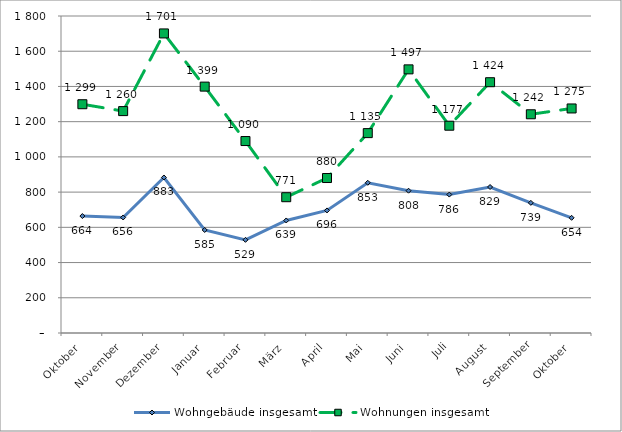
| Category | Wohngebäude insgesamt | Wohnungen insgesamt |
|---|---|---|
| Oktober | 664 | 1299 |
| November | 656 | 1260 |
| Dezember | 883 | 1701 |
| Januar | 585 | 1399 |
| Februar | 529 | 1090 |
| März | 639 | 771 |
| April | 696 | 880 |
| Mai | 853 | 1135 |
| Juni | 808 | 1497 |
| Juli | 786 | 1177 |
| August | 829 | 1424 |
| September | 739 | 1242 |
| Oktober | 654 | 1275 |